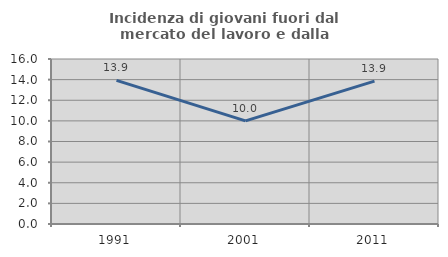
| Category | Incidenza di giovani fuori dal mercato del lavoro e dalla formazione  |
|---|---|
| 1991.0 | 13.929 |
| 2001.0 | 10 |
| 2011.0 | 13.855 |